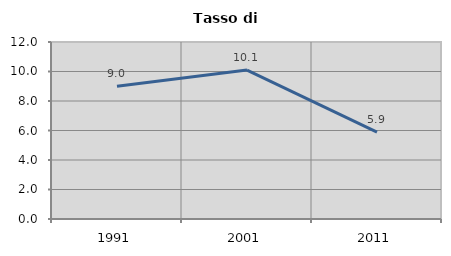
| Category | Tasso di disoccupazione   |
|---|---|
| 1991.0 | 9.007 |
| 2001.0 | 10.099 |
| 2011.0 | 5.895 |